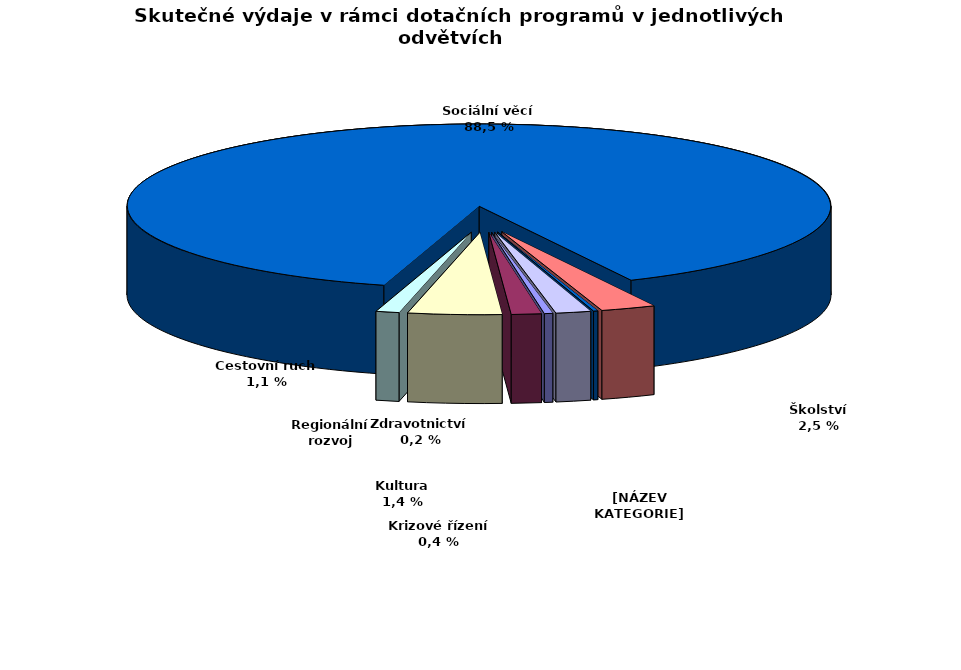
| Category | Series 0 |
|---|---|
| Krizové řízení | 9367.306 |
| Kultura | 33323.543 |
| Regionální rozvoj | 104069.457 |
| Cestovní ruch | 25901.154 |
| Sociální věcí | 2141149.147 |
| Školství | 60969.766 |
| Zdravotnictví | 4847.68 |
| Životní prostředí  | 39027.962 |